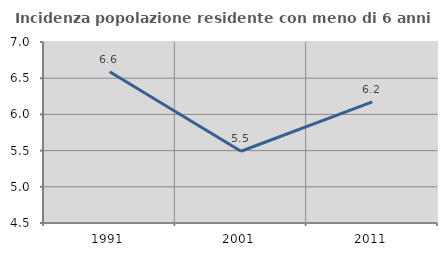
| Category | Incidenza popolazione residente con meno di 6 anni |
|---|---|
| 1991.0 | 6.589 |
| 2001.0 | 5.491 |
| 2011.0 | 6.173 |